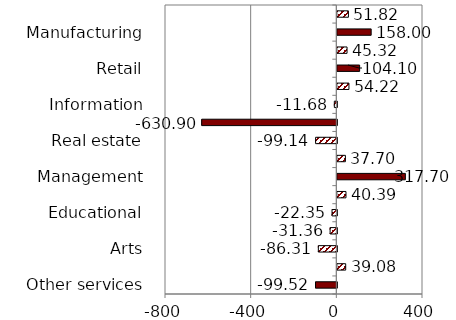
| Category | Series 0 |
|---|---|
| Other services | -99.52 |
| Accommodation | 39.08 |
| Arts | -86.31 |
| Health care | -31.36 |
| Educational | -22.35 |
| Administrative | 40.39 |
| Management | 317.7 |
| Professional | 37.7 |
| Real estate | -99.14 |
| Finance | -630.9 |
| Information | -11.68 |
| Transportation | 54.22 |
| Retail | 104.1 |
| Wholesale | 45.32 |
| Manufacturing | 158 |
| Util., construction | 51.82 |